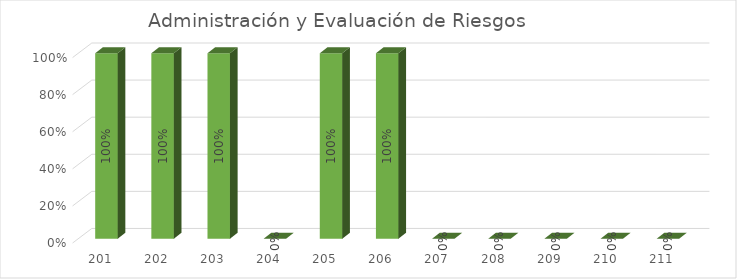
| Category | % Avance |
|---|---|
| 201.0 | 1 |
| 202.0 | 1 |
| 203.0 | 1 |
| 204.0 | 0 |
| 205.0 | 1 |
| 206.0 | 1 |
| 207.0 | 0 |
| 208.0 | 0 |
| 209.0 | 0 |
| 210.0 | 0 |
| 211.0 | 0 |